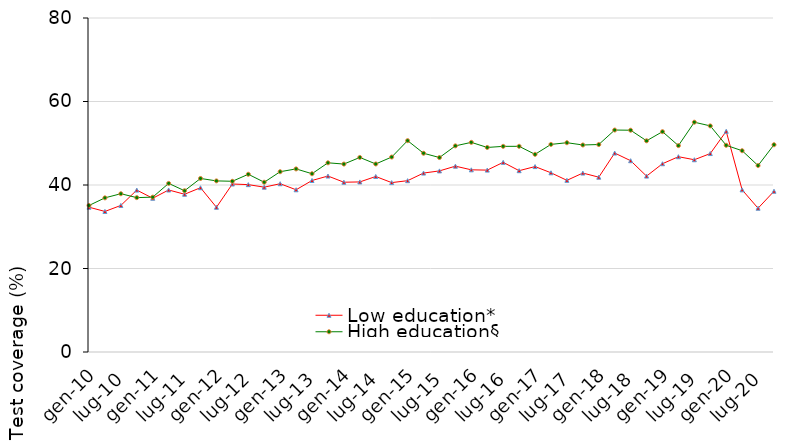
| Category | Low education* | High education§ |
|---|---|---|
| gen-10 | 34.684 | 35.093 |
| apr-10 | 33.666 | 36.923 |
| lug-10 | 35.108 | 37.909 |
| ott-10 | 38.782 | 36.975 |
| gen-11 | 36.824 | 37.093 |
| apr-11 | 38.806 | 40.383 |
| lug-11 | 37.788 | 38.629 |
| ott-11 | 39.352 | 41.565 |
| gen-12 | 34.664 | 40.983 |
| apr-12 | 40.236 | 40.893 |
| lug-12 | 40.088 | 42.569 |
| ott-12 | 39.482 | 40.665 |
| gen-13 | 40.304 | 43.183 |
| apr-13 | 38.856 | 43.853 |
| lug-13 | 41.078 | 42.699 |
| ott-13 | 42.152 | 45.315 |
| gen-14 | 40.664 | 45.013 |
| apr-14 | 40.736 | 46.603 |
| lug-14 | 42.038 | 45.039 |
| ott-14 | 40.572 | 46.695 |
| gen-15 | 41.034 | 50.623 |
| apr-15 | 42.856 | 47.603 |
| lug-15 | 43.378 | 46.579 |
| ott-15 | 44.512 | 49.375 |
| gen-16 | 43.634 | 50.213 |
| apr-16 | 43.566 | 48.993 |
| lug-16 | 45.428 | 49.259 |
| ott-16 | 43.432 | 49.265 |
| gen-17 | 44.414 | 47.343 |
| apr-17 | 42.926 | 49.723 |
| lug-17 | 41.118 | 50.129 |
| ott-17 | 42.862 | 49.585 |
| gen-18 | 41.874 | 49.693 |
| apr-18 | 47.656 | 53.163 |
| lug-18 | 45.818 | 53.119 |
| ott-18 | 42.132 | 50.585 |
| gen-19 | 45.094 | 52.773 |
| apr-19 | 46.776 | 49.433 |
| lug-19 | 46.048 | 55.039 |
| ott-19 | 47.532 | 54.155 |
| gen-20 | 52.864 | 49.513 |
| apr-20 | 38.836 | 48.213 |
| lug-20 | 34.438 | 44.659 |
| ott-20 | 38.502 | 49.645 |